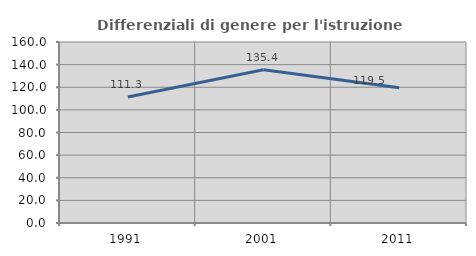
| Category | Differenziali di genere per l'istruzione superiore |
|---|---|
| 1991.0 | 111.347 |
| 2001.0 | 135.449 |
| 2011.0 | 119.498 |